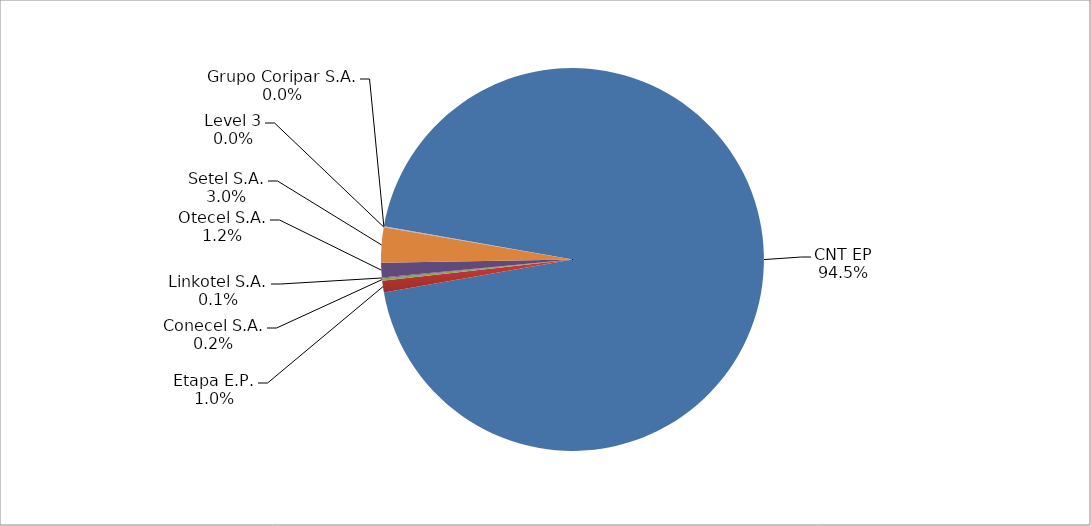
| Category | Series 0 |
|---|---|
| CNT EP | 2079 |
| Etapa E.P. | 22 |
| Conecel S.A. | 4 |
| Linkotel S.A. | 2 |
| Otecel S.A. | 27 |
| Setel S.A. | 65 |
| Level 3 | 1 |
| Grupo Coripar S.A. | 1 |